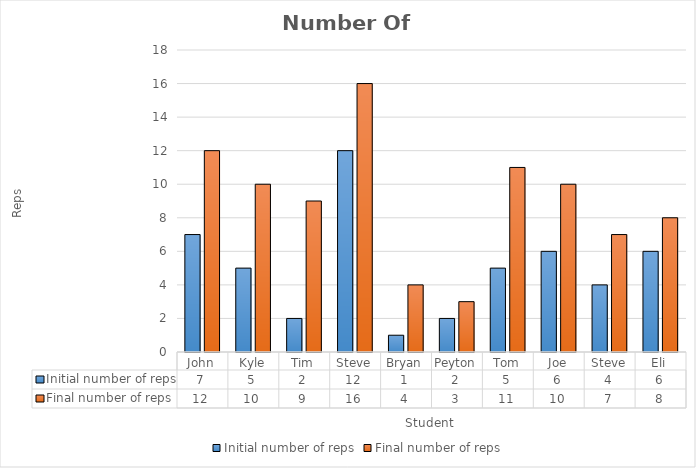
| Category | Initial number of reps | Final number of reps |
|---|---|---|
| John | 7 | 12 |
| Kyle | 5 | 10 |
| Tim | 2 | 9 |
| Steve | 12 | 16 |
| Bryan | 1 | 4 |
| Peyton | 2 | 3 |
| Tom | 5 | 11 |
| Joe | 6 | 10 |
| Steve | 4 | 7 |
| Eli | 6 | 8 |